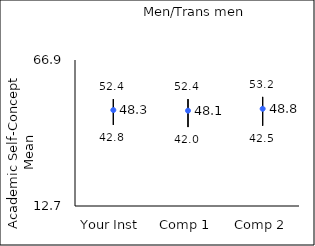
| Category | 25th percentile | 75th percentile | Mean |
|---|---|---|---|
| Your Inst | 42.8 | 52.4 | 48.32 |
| Comp 1 | 42 | 52.4 | 48.08 |
| Comp 2 | 42.5 | 53.2 | 48.79 |